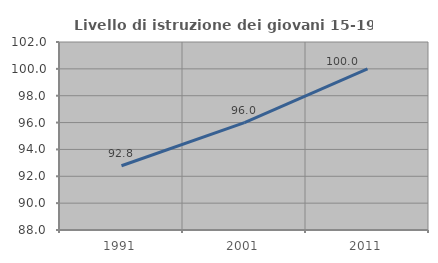
| Category | Livello di istruzione dei giovani 15-19 anni |
|---|---|
| 1991.0 | 92.784 |
| 2001.0 | 96 |
| 2011.0 | 100 |